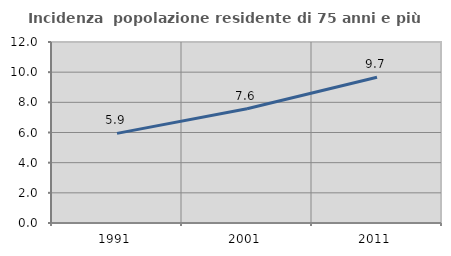
| Category | Incidenza  popolazione residente di 75 anni e più |
|---|---|
| 1991.0 | 5.943 |
| 2001.0 | 7.576 |
| 2011.0 | 9.668 |